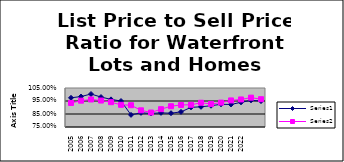
| Category | Series 0 | Series 1 |
|---|---|---|
| 2005.0 | 0.975 | 0.935 |
| 2006.0 | 0.984 | 0.953 |
| 2007.0 | 1.004 | 0.962 |
| 2008.0 | 0.98 | 0.954 |
| 2009.0 | 0.962 | 0.941 |
| 2010.0 | 0.95 | 0.921 |
| 2011.0 | 0.843 | 0.918 |
| 2012.0 | 0.859 | 0.878 |
| 2013.0 | 0.854 | 0.861 |
| 2014.0 | 0.859 | 0.887 |
| 2015.0 | 0.856 | 0.91 |
| 2016.0 | 0.866 | 0.92 |
| 2017.0 | 0.901 | 0.921 |
| 2018.0 | 0.905 | 0.937 |
| 2019.0 | 0.914 | 0.927 |
| 2020.0 | 0.925 | 0.938 |
| 2021.0 | 0.923 | 0.954 |
| 2022.0 | 0.94 | 0.962 |